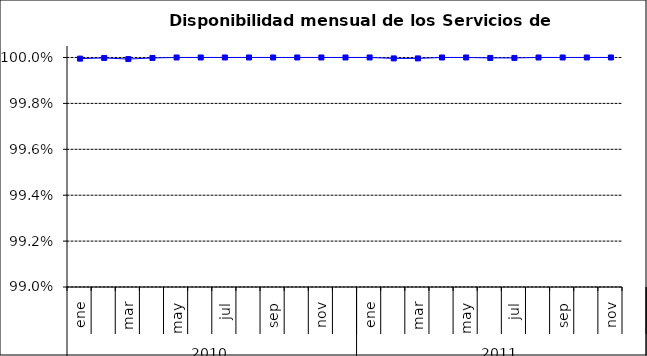
| Category | SCL * |
|---|---|
| 0 | 1 |
| 1 | 1 |
| 2 | 1 |
| 3 | 1 |
| 4 | 1 |
| 5 | 1 |
| 6 | 1 |
| 7 | 1 |
| 8 | 1 |
| 9 | 1 |
| 10 | 1 |
| 11 | 1 |
| 12 | 1 |
| 13 | 1 |
| 14 | 1 |
| 15 | 1 |
| 16 | 1 |
| 17 | 1 |
| 18 | 1 |
| 19 | 1 |
| 20 | 1 |
| 21 | 1 |
| 22 | 1 |